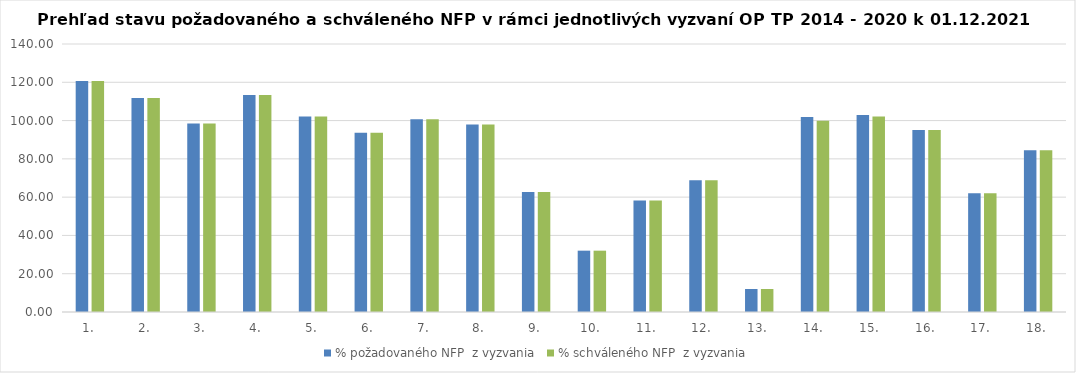
| Category | % požadovaného NFP  z vyzvania | % schváleného NFP  z vyzvania |
|---|---|---|
| 1. | 120.662 | 120.662 |
| 2. | 111.83 | 111.83 |
| 3. | 98.465 | 98.465 |
| 4. | 113.295 | 113.295 |
| 5. | 102.19 | 102.19 |
| 6. | 93.673 | 93.673 |
| 7. | 100.637 | 100.637 |
| 8. | 97.989 | 97.989 |
| 9. | 62.721 | 62.721 |
| 10. | 32.038 | 32.038 |
| 11. | 58.283 | 58.283 |
| 12. | 68.88 | 68.88 |
| 13. | 12.008 | 12.008 |
| 14. | 101.839 | 99.844 |
| 15. | 102.872 | 102.104 |
| 16. | 95.126 | 95.126 |
| 17. | 61.969 | 61.969 |
| 18. | 84.514 | 84.514 |